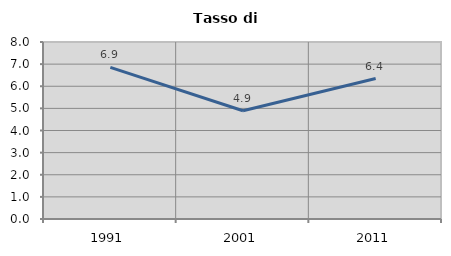
| Category | Tasso di disoccupazione   |
|---|---|
| 1991.0 | 6.85 |
| 2001.0 | 4.894 |
| 2011.0 | 6.35 |